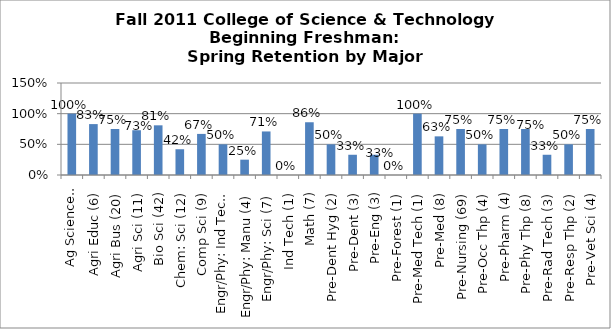
| Category | Series 0 |
|---|---|
| Ag Science: Pre-Vet (1) | 1 |
| Agri Educ (6) | 0.83 |
| Agri Bus (20) | 0.75 |
| Agri Sci (11) | 0.73 |
| Bio Sci (42) | 0.81 |
| Chem: Sci (12) | 0.42 |
| Comp Sci (9) | 0.67 |
| Engr/Phy: Ind Tech (6) | 0.5 |
| Engr/Phy: Manu (4) | 0.25 |
| Engr/Phy: Sci (7) | 0.71 |
| Ind Tech (1) | 0 |
| Math (7) | 0.86 |
| Pre-Dent Hyg (2) | 0.5 |
| Pre-Dent (3) | 0.33 |
| Pre-Eng (3) | 0.33 |
| Pre-Forest (1) | 0 |
| Pre-Med Tech (1) | 1 |
| Pre-Med (8) | 0.63 |
| Pre-Nursing (69) | 0.75 |
| Pre-Occ Thp (4) | 0.5 |
| Pre-Pharm (4) | 0.75 |
| Pre-Phy Thp (8) | 0.75 |
| Pre-Rad Tech (3) | 0.33 |
| Pre-Resp Thp (2) | 0.5 |
| Pre-Vet Sci (4) | 0.75 |